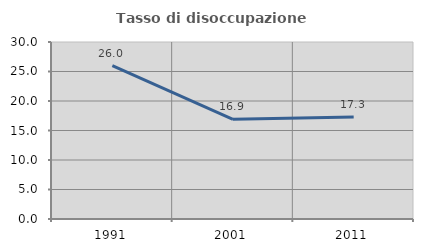
| Category | Tasso di disoccupazione giovanile  |
|---|---|
| 1991.0 | 26 |
| 2001.0 | 16.901 |
| 2011.0 | 17.308 |